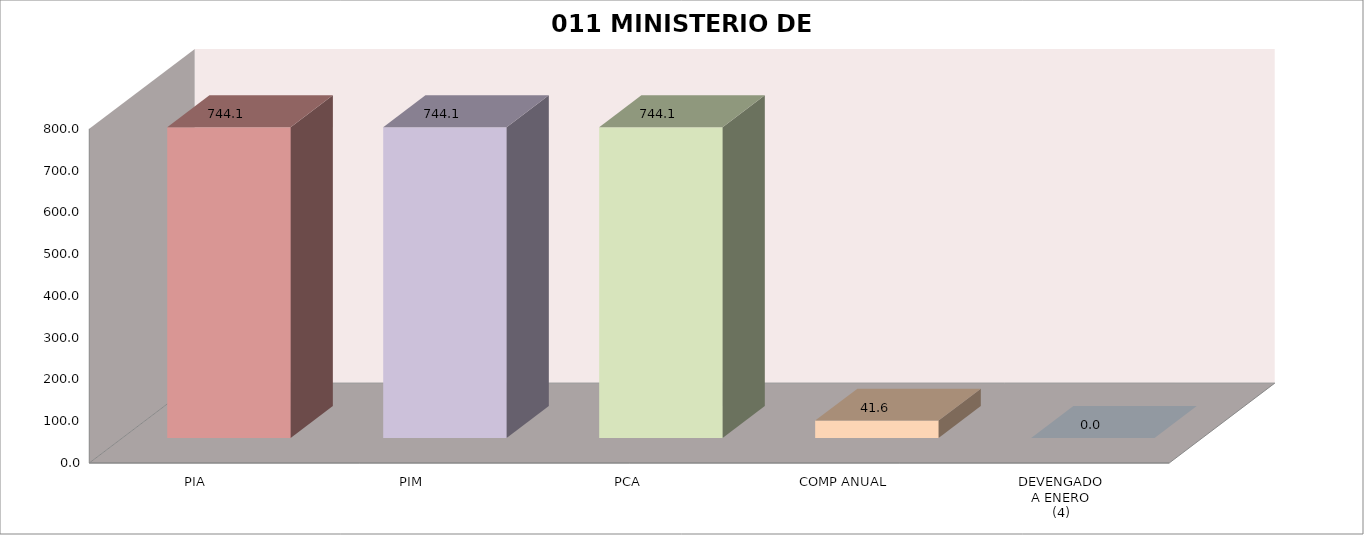
| Category | 011 MINISTERIO DE SALUD |
|---|---|
| PIA | 744.088 |
| PIM | 744.088 |
| PCA | 744.088 |
| COMP ANUAL | 41.595 |
| DEVENGADO
A ENERO
(4) | 0 |